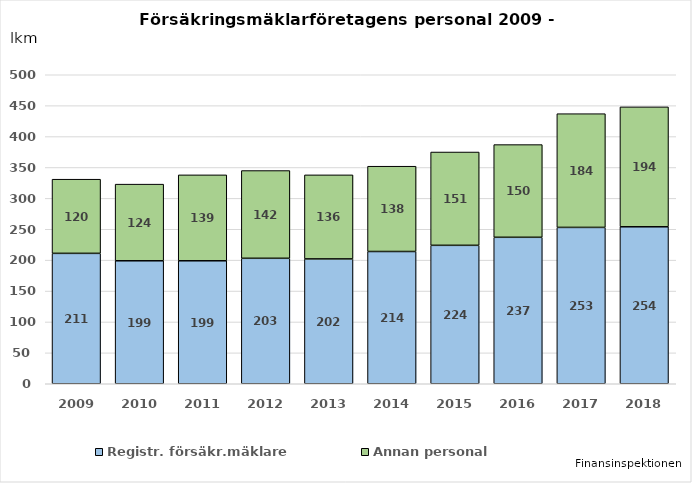
| Category | Registr. försäkr.mäklare | Annan personal |
|---|---|---|
| 2009.0 | 211 | 120 |
| 2010.0 | 199 | 124 |
| 2011.0 | 199 | 139 |
| 2012.0 | 203 | 142 |
| 2013.0 | 202 | 136 |
| 2014.0 | 214 | 138 |
| 2015.0 | 224 | 151 |
| 2016.0 | 237 | 150 |
| 2017.0 | 253 | 184 |
| 2018.0 | 254 | 194 |